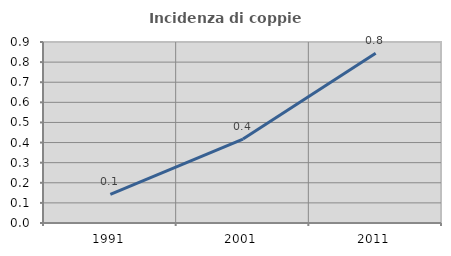
| Category | Incidenza di coppie miste |
|---|---|
| 1991.0 | 0.142 |
| 2001.0 | 0.417 |
| 2011.0 | 0.844 |